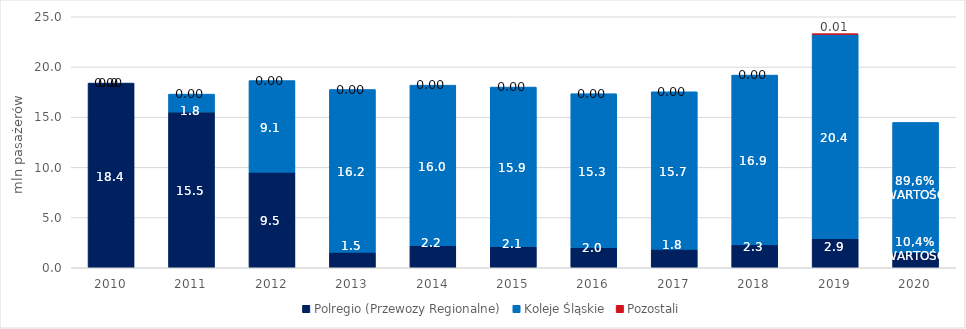
| Category | Polregio (Przewozy Regionalne) | Koleje Śląskie | Pozostali |
|---|---|---|---|
| 2010 | 18.397 | 0 | 0 |
| 2011 | 15.514 | 1.784 | 0 |
| 2012 | 9.52 | 9.127 | 0 |
| 2013 | 1.547 | 16.211 | 0 |
| 2014 | 2.224 | 15.965 | 0 |
| 2015 | 2.111 | 15.89 | 0 |
| 2016 | 2.012 | 15.326 | 0 |
| 2017 | 1.837 | 15.694 | 0 |
| 2018 | 2.281 | 16.912 | 0 |
| 2019 | 2.89 | 20.377 | 0.012 |
| 2020 | 1.506 | 12.971 | 0 |